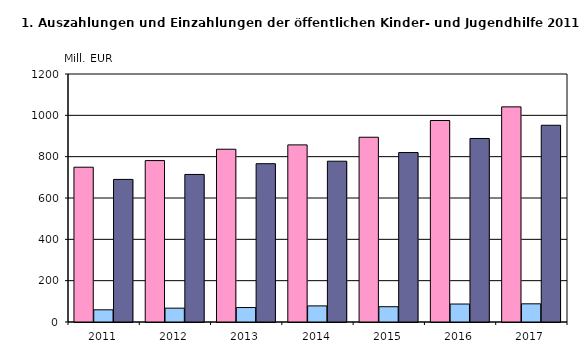
| Category | Ausgaben insgesamt | Einnahmen insgesamt | reine Ausgaben insgesamt |
|---|---|---|---|
| 2011.0 | 749 | 59 | 690 |
| 2012.0 | 781 | 67 | 714 |
| 2013.0 | 836 | 70 | 766 |
| 2014.0 | 857 | 78 | 778 |
| 2015.0 | 894 | 74 | 820 |
| 2016.0 | 975 | 87 | 888 |
| 2017.0 | 1041 | 88 | 952 |